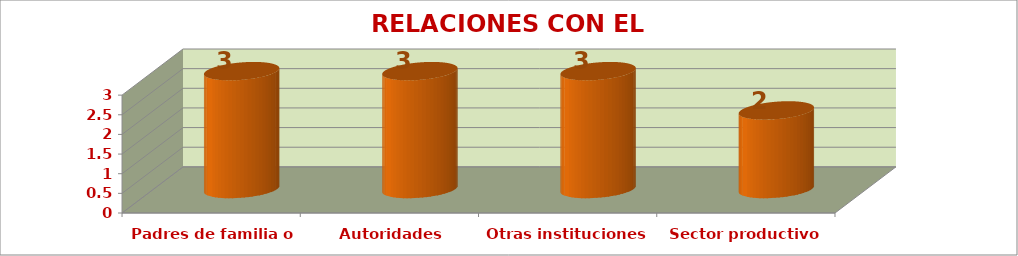
| Category | RELACIONES CON EL ENTORNO |
|---|---|
| Padres de familia o acudientes | 3 |
| Autoridades educativas | 3 |
| Otras instituciones | 3 |
| Sector productivo | 2 |